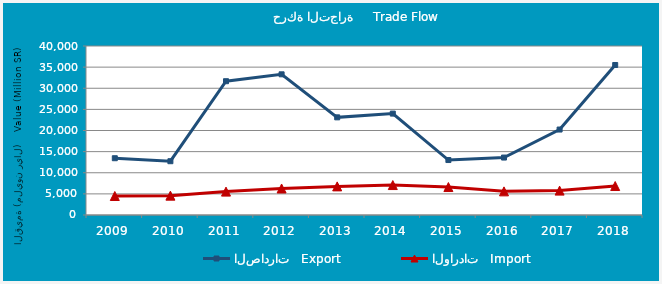
| Category | الصادرات   Export | الواردات   Import |
|---|---|---|
| 2009.0 | 13436463955 | 4493896045 |
| 2010.0 | 12730068223 | 4581695813 |
| 2011.0 | 31667009039 | 5534252755 |
| 2012.0 | 33297933178 | 6273872253 |
| 2013.0 | 23113451306 | 6771460126 |
| 2014.0 | 24000195386 | 7088806851 |
| 2015.0 | 13006960922 | 6616347151 |
| 2016.0 | 13594865272 | 5593917295 |
| 2017.0 | 20228145032 | 5771072815 |
| 2018.0 | 35503727797 | 6856951127 |